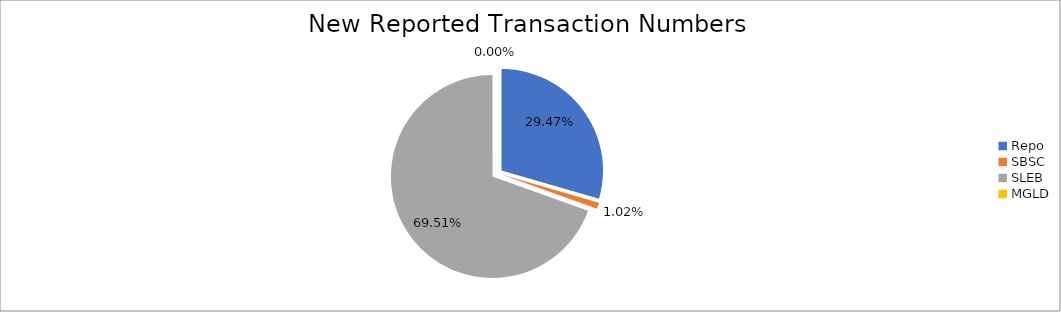
| Category | Series 0 |
|---|---|
| Repo | 290957 |
| SBSC | 10056 |
| SLEB | 686277 |
| MGLD | 30 |